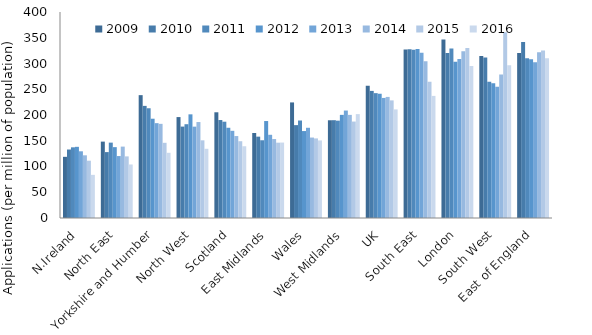
| Category | 2009 | 2010 | 2011 | 2012 | 2013 | 2014 | 2015 | 2016 |
|---|---|---|---|---|---|---|---|---|
| N.Ireland | 118.775 | 132.979 | 137.243 | 138.188 | 129.529 | 121.706 | 111.255 | 83.776 |
| North East | 148.326 | 127.952 | 146.356 | 137.571 | 120.283 | 138.618 | 119.637 | 103.914 |
| Yorkshire and Humber | 238.547 | 217.706 | 213.116 | 192.789 | 184.162 | 182.836 | 145.995 | 126.62 |
| North West | 195.958 | 177.495 | 182.115 | 201.29 | 177.382 | 186.317 | 150.827 | 134.356 |
| Scotland | 205.279 | 190.225 | 186.985 | 175.211 | 169.304 | 159.137 | 149.079 | 139.323 |
| East Midlands | 165.038 | 157.973 | 150.968 | 188.279 | 161.578 | 153.319 | 146.248 | 146.474 |
| Wales | 224.423 | 180.328 | 189.307 | 168.83 | 175.188 | 156.21 | 154.561 | 150.649 |
| West Midlands | 189.761 | 189.906 | 188.992 | 200.262 | 208.645 | 200.235 | 187.272 | 201.7 |
| UK | 256.744 | 246.815 | 242.443 | 241.269 | 233.147 | 235.105 | 228.383 | 210.852 |
| South East | 327.056 | 327.59 | 326.831 | 328.378 | 320.831 | 304.379 | 264.755 | 237.085 |
| London | 346.486 | 320.536 | 329.214 | 303.548 | 308.798 | 323.937 | 330.194 | 294.951 |
| South West | 314.533 | 311.52 | 264.677 | 261.817 | 254.946 | 278.428 | 360.798 | 296.41 |
| East of England | 320.618 | 341.633 | 310.112 | 308.263 | 302.638 | 322.012 | 325.352 | 310.252 |